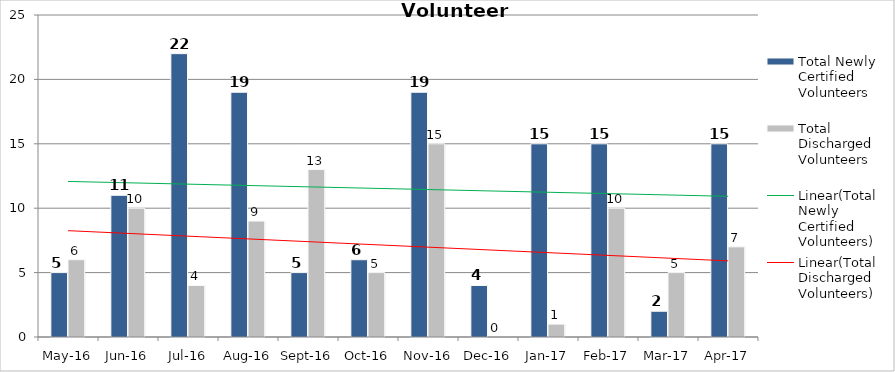
| Category | Total Newly Certified Volunteers | Total Discharged Volunteers |
|---|---|---|
| May-16 | 5 | 6 |
| Jun-16 | 11 | 10 |
| Jul-16 | 22 | 4 |
| Aug-16 | 19 | 9 |
| Sep-16 | 5 | 13 |
| Oct-16 | 6 | 5 |
| Nov-16 | 19 | 15 |
| Dec-16 | 4 | 0 |
| Jan-17 | 15 | 1 |
| Feb-17 | 15 | 10 |
| Mar-17 | 2 | 5 |
| Apr-17 | 15 | 7 |